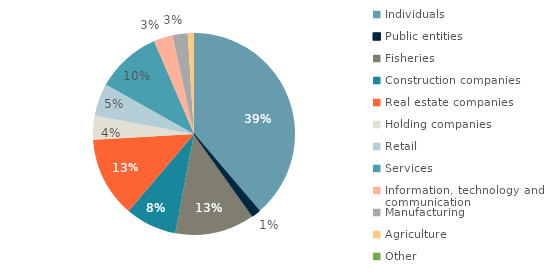
| Category | Series 0 |
|---|---|
| Individuals | 337474 |
| Public entities | 12042 |
| Fisheries | 111635 |
| Construction companies  | 71788 |
| Real estate companies | 112185 |
| Holding companies | 33340 |
| Retail | 45215 |
| Services | 90382 |
| Information, technology and communication | 26561 |
| Manufacturing | 21217 |
| Agriculture | 8643 |
| Other | 1 |